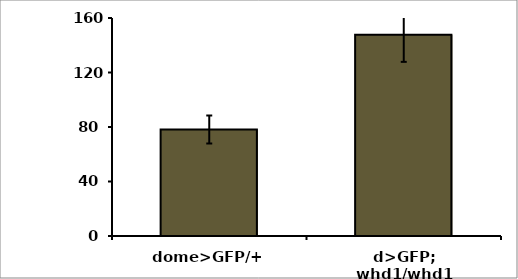
| Category | Series 0 |
|---|---|
| dome>GFP/+ | 78.166 |
| d>GFP; whd1/whd1 | 147.708 |